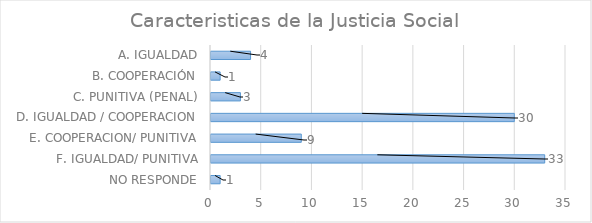
| Category | Series 0 |
|---|---|
| NO RESPONDE | 1 |
| F. IGUALDAD/ PUNITIVA | 33 |
| E. COOPERACION/ PUNITIVA | 9 |
| D. IGUALDAD / COOPERACION | 30 |
| C. PUNITIVA (PENAL) | 3 |
| B. COOPERACIÓN | 1 |
| A. IGUALDAD | 4 |